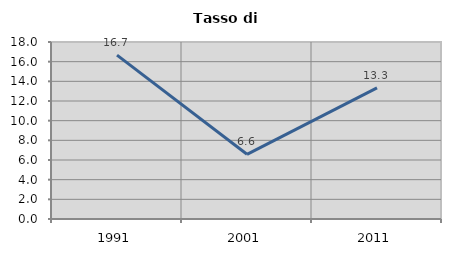
| Category | Tasso di disoccupazione   |
|---|---|
| 1991.0 | 16.667 |
| 2001.0 | 6.579 |
| 2011.0 | 13.333 |